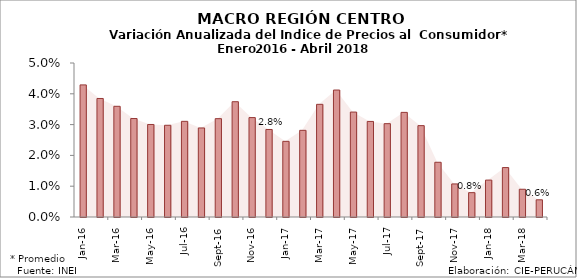
| Category | Series 0 |
|---|---|
| 2016-01-01 | 0.043 |
| 2016-02-01 | 0.038 |
| 2016-03-01 | 0.036 |
| 2016-04-01 | 0.032 |
| 2016-05-01 | 0.03 |
| 2016-06-01 | 0.03 |
| 2016-07-01 | 0.031 |
| 2016-08-01 | 0.029 |
| 2016-09-01 | 0.032 |
| 2016-10-01 | 0.037 |
| 2016-11-01 | 0.032 |
| 2016-12-01 | 0.028 |
| 2017-01-01 | 0.025 |
| 2017-02-01 | 0.028 |
| 2017-03-01 | 0.037 |
| 2017-04-01 | 0.041 |
| 2017-05-01 | 0.034 |
| 2017-06-01 | 0.031 |
| 2017-07-01 | 0.03 |
| 2017-08-01 | 0.034 |
| 2017-09-01 | 0.03 |
| 2017-10-01 | 0.018 |
| 2017-11-01 | 0.011 |
| 2017-12-01 | 0.008 |
| 2018-01-01 | 0.012 |
| 2018-02-01 | 0.016 |
| 2018-03-01 | 0.009 |
| 2018-04-01 | 0.006 |